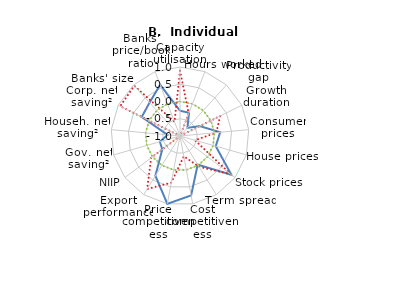
| Category | Q4 2016 (or latest data available) | 2007 | Long-term average |
|---|---|---|---|
| Capacity utilisation | -0.269 | 0.893 | 0 |
| Hours worked | -0.276 | -0.299 | 0 |
| Productivity gap | -0.68 | -0.993 | 0 |
| Growth duration | -0.357 | 0.301 | 0 |
| Consumer prices | 0.169 | 0.056 | 0 |
| House prices | 0.077 | -0.547 | 0 |
| Stock prices | 0.866 | 0.838 | 0 |
| Term spread | -0.025 | 0.05 | 0 |
| Cost competitiveness | 0.753 | -0.402 | 0 |
| Price competitiveness | 1 | 0.376 | 0 |
| Export performance | 0.356 | 0.809 | 0 |
| NIIP | -0.357 | 0.048 | 0 |
| Gov. net saving² | -0.393 | -1 | 0 |
| Househ. net saving² | -0.638 | -1 | 0 |
| Corp. net saving² | 0.239 | 0.937 | 0 |
| Banks' size | 0.309 | 0.968 | 0 |
| Banks' price/book ratio | 0.593 | -0.56 | 0 |